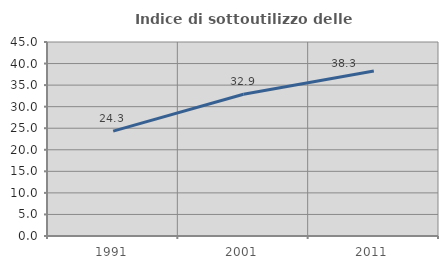
| Category | Indice di sottoutilizzo delle abitazioni  |
|---|---|
| 1991.0 | 24.324 |
| 2001.0 | 32.873 |
| 2011.0 | 38.283 |